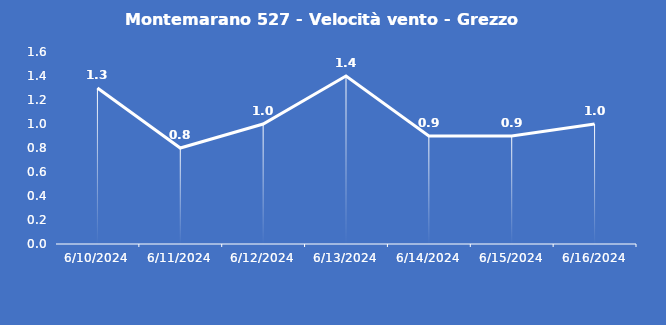
| Category | Montemarano 527 - Velocità vento - Grezzo (m/s) |
|---|---|
| 6/10/24 | 1.3 |
| 6/11/24 | 0.8 |
| 6/12/24 | 1 |
| 6/13/24 | 1.4 |
| 6/14/24 | 0.9 |
| 6/15/24 | 0.9 |
| 6/16/24 | 1 |